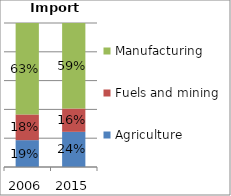
| Category | Agriculture | Fuels and mining | Manufacturing |
|---|---|---|---|
| 2006.0 | 0.186 | 0.179 | 0.635 |
| 2015.0 | 0.244 | 0.162 | 0.594 |